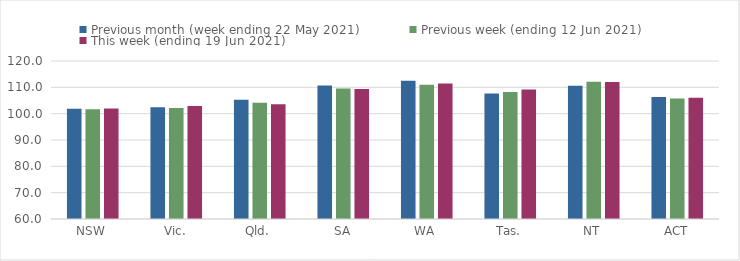
| Category | Previous month (week ending 22 May 2021) | Previous week (ending 12 Jun 2021) | This week (ending 19 Jun 2021) |
|---|---|---|---|
| NSW | 101.85 | 101.68 | 101.98 |
| Vic. | 102.43 | 102.18 | 102.87 |
| Qld. | 105.25 | 104.15 | 103.59 |
| SA | 110.68 | 109.52 | 109.33 |
| WA | 112.49 | 110.97 | 111.47 |
| Tas. | 107.69 | 108.2 | 109.2 |
| NT | 110.63 | 112.16 | 112.04 |
| ACT | 106.34 | 105.75 | 106.01 |